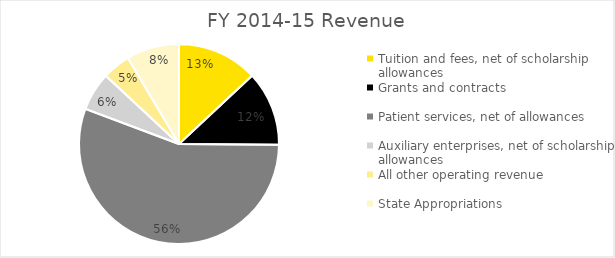
| Category | Series 0 |
|---|---|
| Tuition and fees, net of scholarship allowances | 377.8 |
| Grants and contracts | 351 |
| Patient services, net of allowances | 1611.6 |
| Auxiliary enterprises, net of scholarship allowances | 180.6 |
| All other operating revenue | 131.5 |
| State Appropriations | 247.3 |